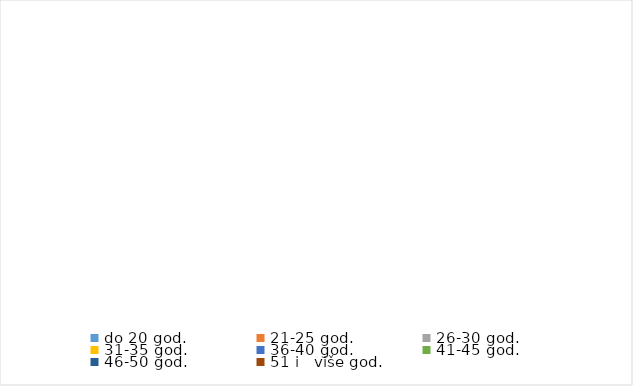
| Category | Series 0 |
|---|---|
| do 20 god. | 0 |
| 21-25 god. | 0 |
| 26-30 god. | 0 |
| 31-35 god. | 0 |
| 36-40 god. | 0 |
| 41-45 god. | 0 |
| 46-50 god. | 0 |
| 51 i   više god. | 0 |